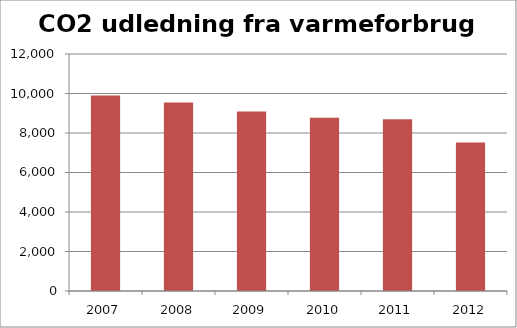
| Category | CO2 udledning fra varmeforbrug (ton) |
|---|---|
| 2007.0 | 9899.408 |
| 2008.0 | 9549.191 |
| 2009.0 | 9090.304 |
| 2010.0 | 8768.451 |
| 2011.0 | 8697.025 |
| 2012.0 | 7516.946 |